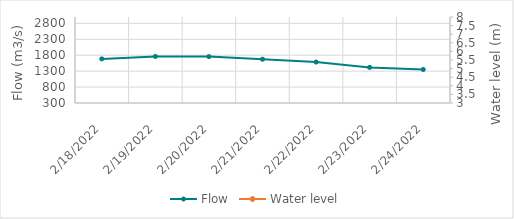
| Category | Flow |
|---|---|
| 2/23/22 | 1432.57 |
| 2/22/22 | 1585.46 |
| 2/21/22 | 1674.67 |
| 2/20/22 | 1756.03 |
| 2/19/22 | 1761.23 |
| 2/18/22 | 1685.12 |
| 2/17/22 | 1607 |